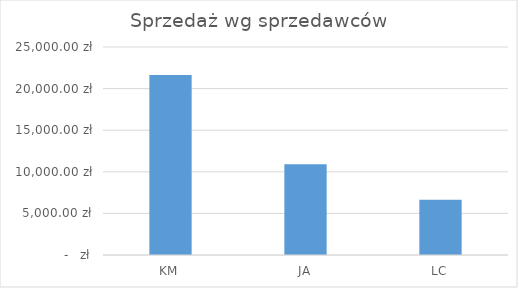
| Category | Series 0 |
|---|---|
| KM | 21648 |
| JA | 10921 |
| LC | 6642 |